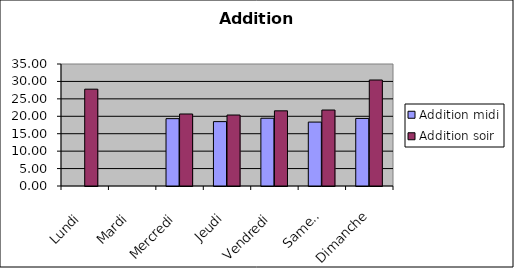
| Category | Addition |
|---|---|
| Lundi | 27.778 |
| Mardi | 0 |
| Mercredi | 20.66 |
| Jeudi | 20.362 |
| Vendredi | 21.562 |
| Samedi | 21.798 |
| Dimanche | 30.408 |